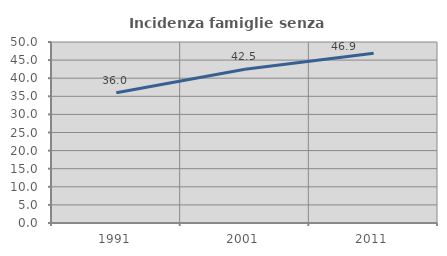
| Category | Incidenza famiglie senza nuclei |
|---|---|
| 1991.0 | 35.972 |
| 2001.0 | 42.453 |
| 2011.0 | 46.87 |